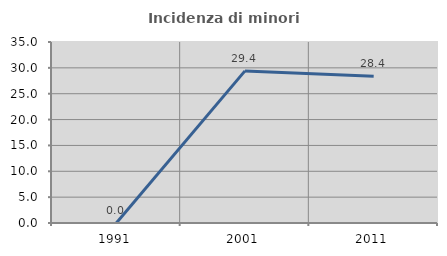
| Category | Incidenza di minori stranieri |
|---|---|
| 1991.0 | 0 |
| 2001.0 | 29.412 |
| 2011.0 | 28.387 |